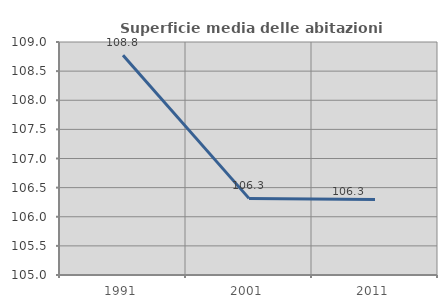
| Category | Superficie media delle abitazioni occupate |
|---|---|
| 1991.0 | 108.773 |
| 2001.0 | 106.315 |
| 2011.0 | 106.296 |